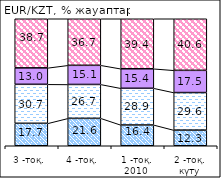
| Category | повысится | не изменится | снизится | білмеймін |
|---|---|---|---|---|
| 3 -тоқ. | 17.68 | 30.7 | 12.96 | 38.66 |
| 4 -тоқ. | 21.58 | 26.69 | 15.07 | 36.65 |
| 1 -тоқ. 2010  | 16.36 | 28.9 | 15.35 | 39.39 |
| 2 -тоқ. күту | 12.31 | 29.57 | 17.51 | 40.6 |